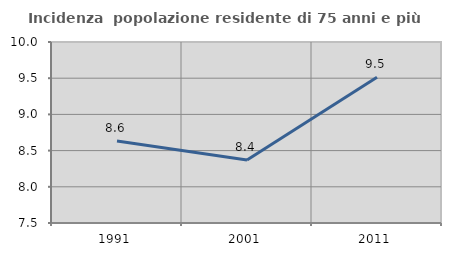
| Category | Incidenza  popolazione residente di 75 anni e più |
|---|---|
| 1991.0 | 8.633 |
| 2001.0 | 8.371 |
| 2011.0 | 9.514 |